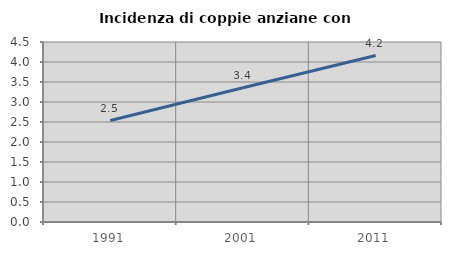
| Category | Incidenza di coppie anziane con figli |
|---|---|
| 1991.0 | 2.536 |
| 2001.0 | 3.355 |
| 2011.0 | 4.162 |